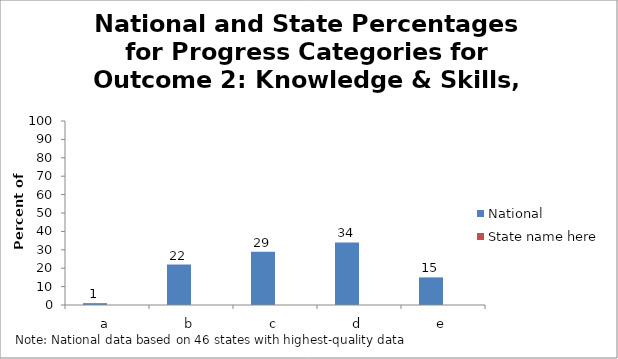
| Category | National | State name here |
|---|---|---|
| a | 1 |  |
| b | 22 |  |
| c | 29 |  |
| d | 34 |  |
| e | 15 |  |